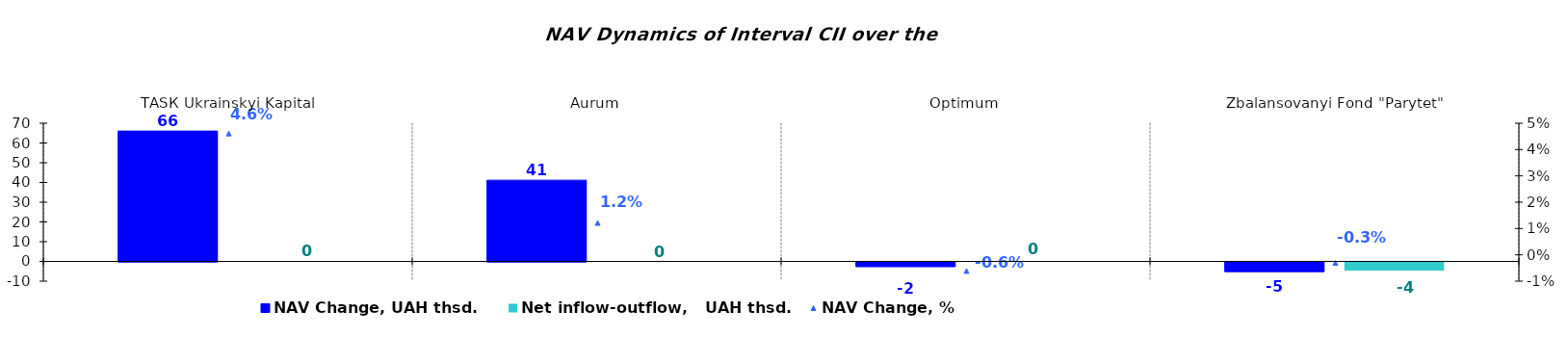
| Category | NAV Change, UAH thsd. | Net inflow-outflow,   UAH thsd. |
|---|---|---|
| ТАSК Ukrainskyi Kapital | 66.039 | 0 |
| Аurum | 41.138 | 0 |
| Оptimum | -2.362 | 0 |
| Zbalansovanyi Fond "Parytet" | -4.901 | -4.193 |